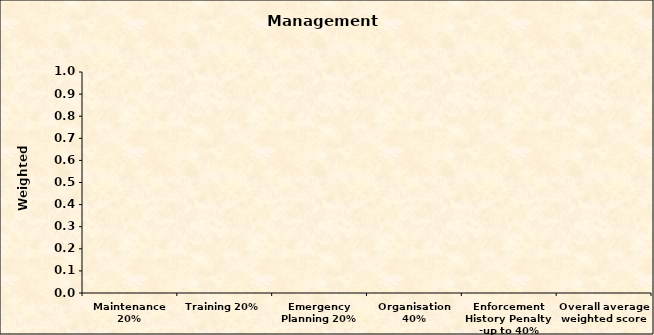
| Category | Series 0 |
|---|---|
| Maintenance 20% | 0 |
| Training 20% | 0 |
| Emergency Planning 20% | 0 |
| Organisation 40% | 0 |
| Enforcement History Penalty -up to 40% | 0 |
| Overall average weighted score | 0 |